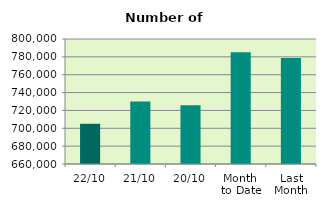
| Category | Series 0 |
|---|---|
| 22/10 | 705032 |
| 21/10 | 729912 |
| 20/10 | 725828 |
| Month 
to Date | 785088 |
| Last
Month | 778605.273 |